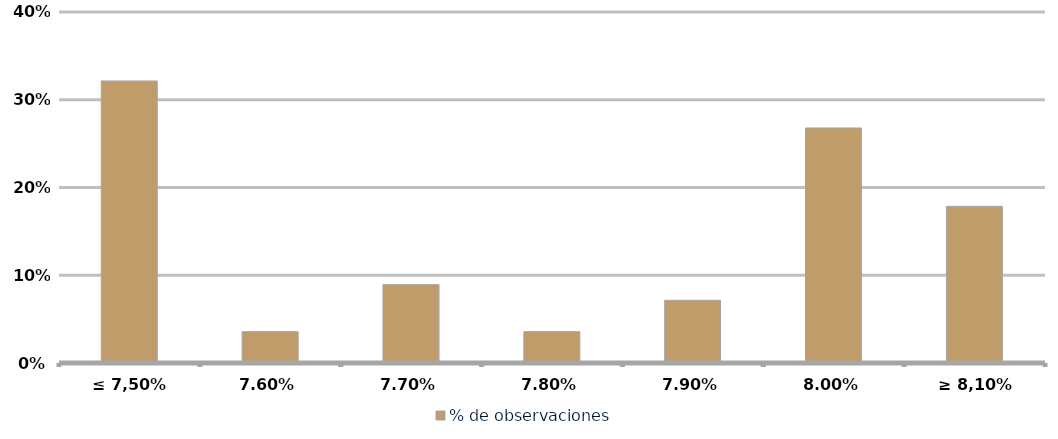
| Category | % de observaciones  |
|---|---|
| ≤ 7,50% | 0.321 |
| 7,60% | 0.036 |
| 7,70% | 0.089 |
| 7,80% | 0.036 |
| 7,90% | 0.071 |
| 8,00% | 0.268 |
| ≥ 8,10% | 0.179 |